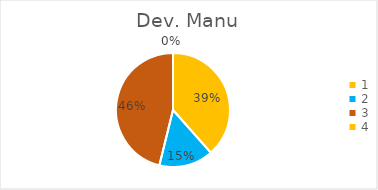
| Category | Series 0 |
|---|---|
| 0 | 0.385 |
| 1 | 0.154 |
| 2 | 0.462 |
| 3 | 0 |